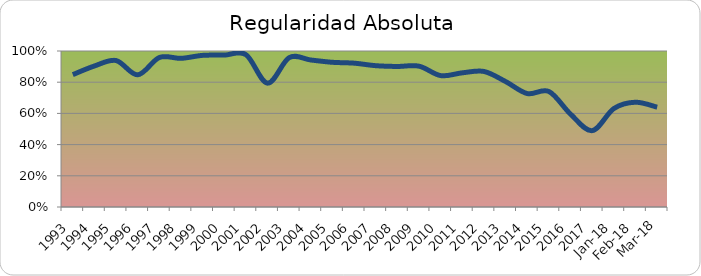
| Category | Series 0 |
|---|---|
| 1993.0 | 0.849 |
| 1994.0 | 0.904 |
| 1995.0 | 0.939 |
| 1996.0 | 0.847 |
| 1997.0 | 0.958 |
| 1998.0 | 0.953 |
| 1999.0 | 0.972 |
| 2000.0 | 0.974 |
| 2001.0 | 0.976 |
| 2002.0 | 0.794 |
| 2003.0 | 0.958 |
| 2004.0 | 0.942 |
| 2005.0 | 0.927 |
| 2006.0 | 0.922 |
| 2007.0 | 0.906 |
| 2008.0 | 0.901 |
| 2009.0 | 0.903 |
| 2010.0 | 0.842 |
| 2011.0 | 0.86 |
| 2012.0 | 0.869 |
| 2013.0 | 0.804 |
| 2014.0 | 0.727 |
| 2015.0 | 0.74 |
| 2016.0 | 0.595 |
| 2017.0 | 0.49 |
| 43101.0 | 0.631 |
| 43132.0 | 0.672 |
| 43160.0 | 0.64 |